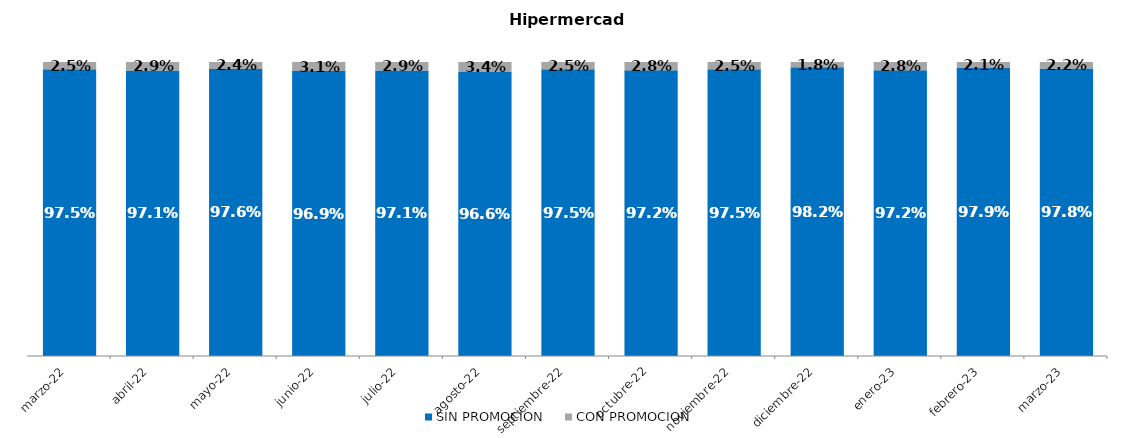
| Category | SIN PROMOCION   | CON PROMOCION   |
|---|---|---|
| 2022-03-01 | 0.975 | 0.025 |
| 2022-04-01 | 0.971 | 0.029 |
| 2022-05-01 | 0.976 | 0.024 |
| 2022-06-01 | 0.969 | 0.031 |
| 2022-07-01 | 0.971 | 0.029 |
| 2022-08-01 | 0.966 | 0.034 |
| 2022-09-01 | 0.975 | 0.025 |
| 2022-10-01 | 0.972 | 0.028 |
| 2022-11-01 | 0.975 | 0.025 |
| 2022-12-01 | 0.982 | 0.018 |
| 2023-01-01 | 0.972 | 0.028 |
| 2023-02-01 | 0.979 | 0.021 |
| 2023-03-01 | 0.978 | 0.022 |